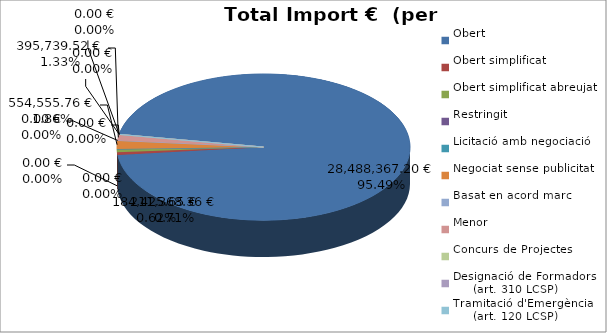
| Category | Total preu
(amb IVA) |
|---|---|
| Obert | 28488367.2 |
| Obert simplificat | 184425.65 |
| Obert simplificat abreujat | 211368.36 |
| Restringit | 0 |
| Licitació amb negociació | 0 |
| Negociat sense publicitat | 554555.76 |
| Basat en acord marc | 0 |
| Menor | 395739.52 |
| Concurs de Projectes | 0 |
| Designació de Formadors
     (art. 310 LCSP) | 0 |
| Tramitació d'Emergència
     (art. 120 LCSP) | 0 |